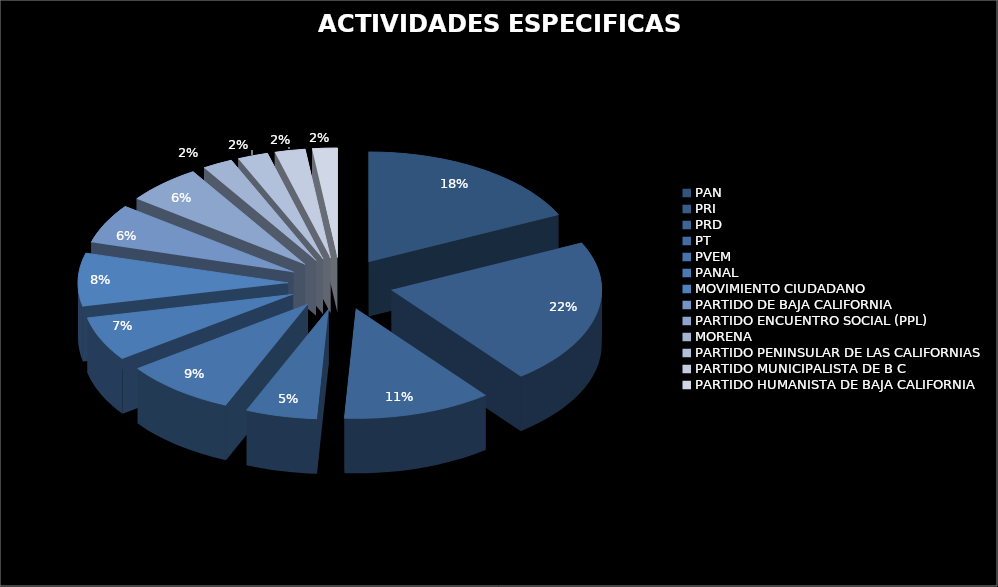
| Category | Series 0 |
|---|---|
| PAN | 639869.23 |
| PRI | 767442.55 |
| PRD | 408125.01 |
| PT | 195852.44 |
| PVEM | 308232.03 |
| PANAL | 233312.3 |
| MOVIMIENTO CIUDADANO | 279065.28 |
| PARTIDO DE BAJA CALIFORNIA | 208339.06 |
| PARTIDO ENCUENTRO SOCIAL (PPL) | 208339.06 |
| MORENA | 83472.84 |
| PARTIDO PENINSULAR DE LAS CALIFORNIAS | 83472.84 |
| PARTIDO MUNICIPALISTA DE B C | 83472.84 |
| PARTIDO HUMANISTA DE BAJA CALIFORNIA | 68607.81 |